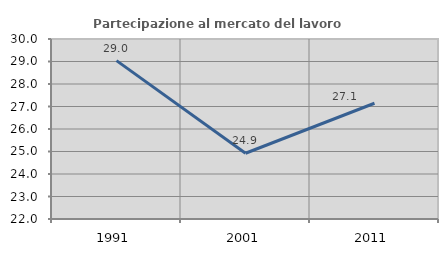
| Category | Partecipazione al mercato del lavoro  femminile |
|---|---|
| 1991.0 | 29.039 |
| 2001.0 | 24.921 |
| 2011.0 | 27.144 |